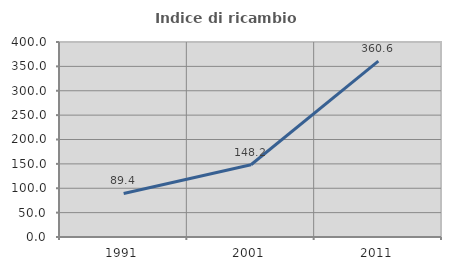
| Category | Indice di ricambio occupazionale  |
|---|---|
| 1991.0 | 89.372 |
| 2001.0 | 148.219 |
| 2011.0 | 360.617 |